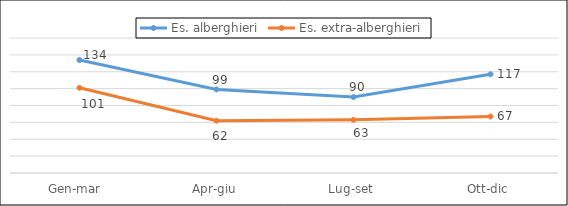
| Category | Es. alberghieri | Es. extra-alberghieri |
|---|---|---|
| Gen-mar  | 134 | 101 |
| Apr-giu | 99 | 62 |
| Lug-set | 90 | 63 |
| Ott-dic | 117 | 67 |